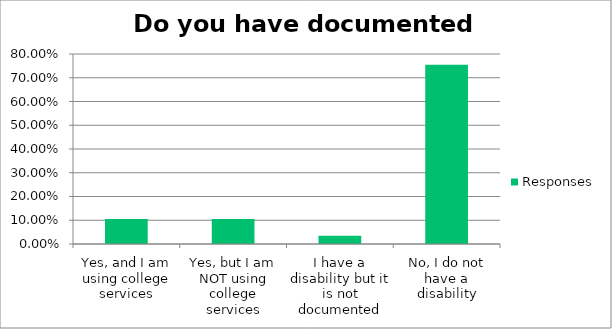
| Category | Responses |
|---|---|
| Yes, and I am using college services | 0.105 |
| Yes, but I am NOT using college services | 0.105 |
| I have a disability but it is not documented | 0.035 |
| No, I do not have a disability | 0.754 |